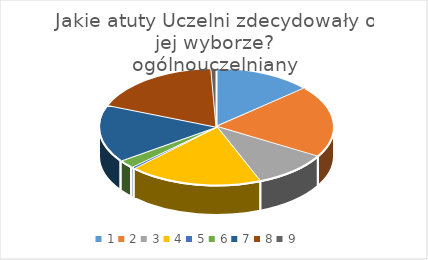
| Category | Series 0 |
|---|---|
| 0 | 113 |
| 1 | 166 |
| 2 | 87 |
| 3 | 154 |
| 4 | 4 |
| 5 | 19 |
| 6 | 132 |
| 7 | 152 |
| 8 | 6 |